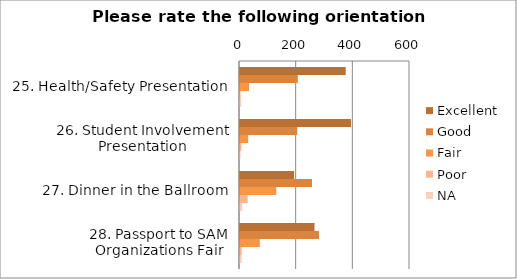
| Category | Excellent | Good | Fair | Poor | NA |
|---|---|---|---|---|---|
| 25. Health/Safety Presentation | 373 | 204 | 32 | 2 | 4 |
| 26. Student Involvement Presentation | 392 | 202 | 29 | 5 | 2 |
| 27. Dinner in the Ballroom | 191 | 254 | 128 | 27 | 8 |
| 28. Passport to SAM Organizations Fair | 263 | 279 | 70 | 6 | 6 |